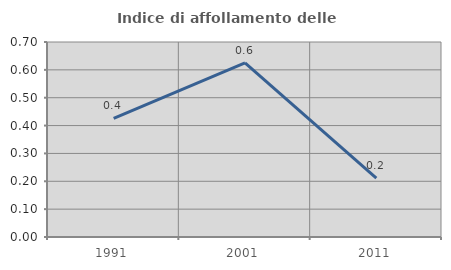
| Category | Indice di affollamento delle abitazioni  |
|---|---|
| 1991.0 | 0.426 |
| 2001.0 | 0.625 |
| 2011.0 | 0.211 |